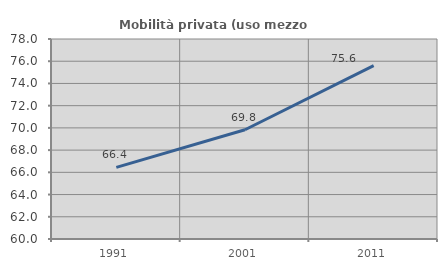
| Category | Mobilità privata (uso mezzo privato) |
|---|---|
| 1991.0 | 66.449 |
| 2001.0 | 69.833 |
| 2011.0 | 75.61 |